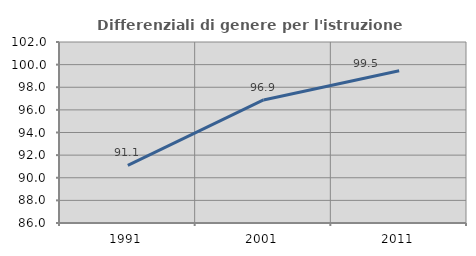
| Category | Differenziali di genere per l'istruzione superiore |
|---|---|
| 1991.0 | 91.095 |
| 2001.0 | 96.878 |
| 2011.0 | 99.454 |